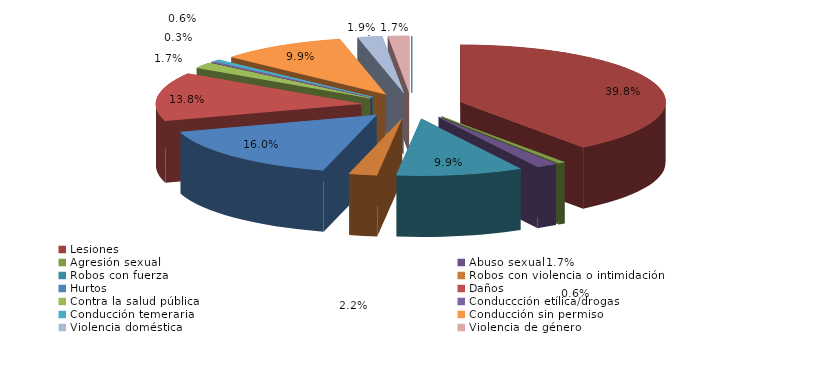
| Category | Series 0 |
|---|---|
| Homicidio/Asesinato dolosos | 0 |
| Lesiones | 144 |
| Agresión sexual | 2 |
| Abuso sexual | 6 |
| Robos con fuerza | 36 |
| Robos con violencia o intimidación | 8 |
| Hurtos | 58 |
| Daños | 50 |
| Contra la salud pública | 6 |
| Conduccción etílica/drogas | 1 |
| Conducción temeraria | 2 |
| Conducción sin permiso | 36 |
| Violencia doméstica | 7 |
| Violencia de género | 6 |
| Otros | 0 |
| Atentados y delitos de resistencia y desobediencia grave | 0 |
| Otros delitos contra el orden público | 0 |